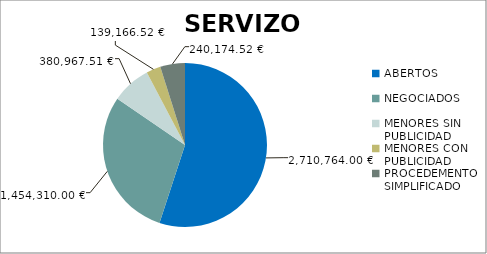
| Category | Series 0 |
|---|---|
| ABERTOS  | 2710764 |
| NEGOCIADOS  | 1454310 |
| MENORES SIN PUBLICIDAD | 380967.51 |
| MENORES CON PUBLICIDAD | 139166.52 |
| PROCEDEMENTO SIMPLIFICADO | 240174.52 |